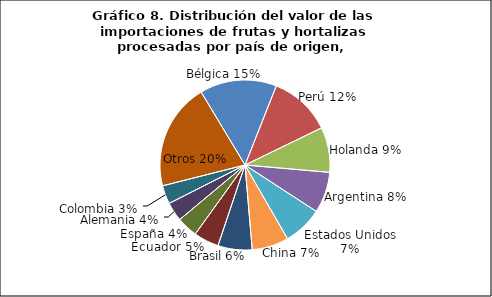
| Category | Series 0 |
|---|---|
| Bélgica | 59444365.09 |
| Perú | 48083791 |
| Holanda | 34883150.88 |
| Argentina | 31736384.15 |
| Estados Unidos | 30488671.02 |
| China | 28378109.19 |
| Brasil | 26444878.43 |
| Ecuador | 19504234.11 |
| España | 16210884.66 |
| Alemania | 14744272.08 |
| Colombia | 14314130.93 |
| Otros | 82737999.68 |